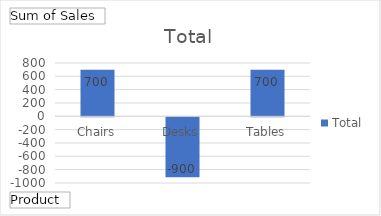
| Category | Total |
|---|---|
| Chairs | 700 |
| Desks | -900 |
| Tables | 700 |